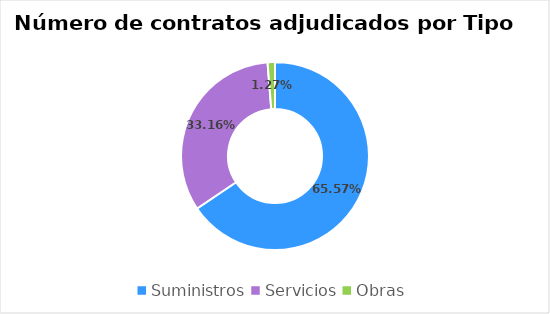
| Category | Series 0 |
|---|---|
| Suministros | 0.656 |
| Servicios | 0.332 |
| Obras | 0.013 |